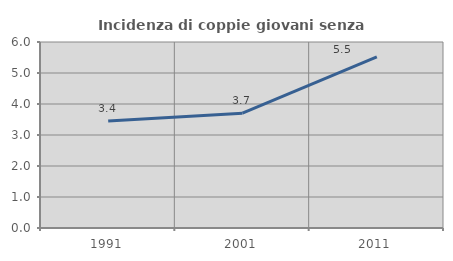
| Category | Incidenza di coppie giovani senza figli |
|---|---|
| 1991.0 | 3.448 |
| 2001.0 | 3.704 |
| 2011.0 | 5.517 |